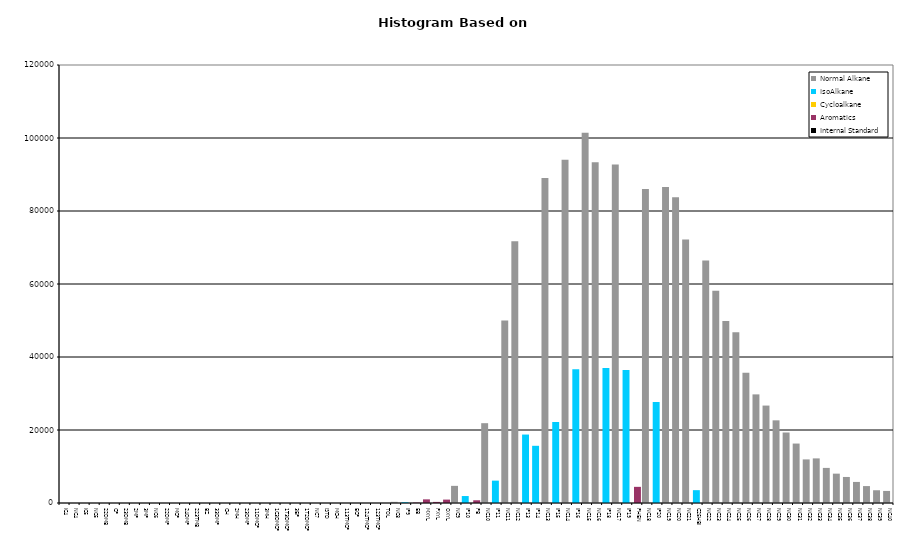
| Category | Normal Alkane | IsoAlkane | Cycloalkane | Aromatics | Internal Standard |
|---|---|---|---|---|---|
| IC4 | 0 | 0 | 0 | 0 | 0 |
| NC4 | 0 | 0 | 0 | 0 | 0 |
| IC5 | 0 | 0 | 0 | 0 | 0 |
| NC5 | 0 | 0 | 0 | 0 | 0 |
| 22DMB | 0 | 0 | 0 | 0 | 0 |
| CP | 0 | 0 | 0 | 0 | 0 |
| 23DMB | 0 | 0 | 0 | 0 | 0 |
| 2MP | 0 | 0 | 0 | 0 | 0 |
| 3MP | 0 | 0 | 0 | 0 | 0 |
| NC6 | 0 | 0 | 0 | 0 | 0 |
| 22DMP | 0 | 0 | 0 | 0 | 0 |
| MCP | 0 | 0 | 0 | 0 | 0 |
| 24DMP | 0 | 0 | 0 | 0 | 0 |
| 223TMB | 0 | 0 | 0 | 0 | 0 |
| BZ | 0 | 0 | 0 | 0 | 0 |
| 33DMP | 0 | 0 | 0 | 0 | 0 |
| CH | 0 | 0 | 0 | 0 | 0 |
| 2MH | 0 | 0 | 0 | 0 | 0 |
| 23DMP | 0 | 0 | 0 | 0 | 0 |
| 11DMCP | 0 | 0 | 0 | 0 | 0 |
| 3MH | 0 | 0 | 0 | 0 | 0 |
| 1C3DMCP | 0 | 0 | 0 | 0 | 0 |
| 1T3DMCP | 0 | 0 | 0 | 0 | 0 |
| 3EP | 0 | 0 | 0 | 0 | 0 |
| 1T2DMCP | 0 | 0 | 0 | 0 | 0 |
| NC7 | 0 | 0 | 0 | 0 | 0 |
| ISTD | 0 | 0 | 0 | 0 | 0 |
| MCH | 0 | 0 | 0 | 0 | 0 |
| 113TMCP | 0 | 0 | 0 | 0 | 0 |
| ECP | 0 | 0 | 0 | 0 | 0 |
| 124TMCP | 0 | 0 | 0 | 0 | 0 |
| 123TMCP | 0 | 0 | 0 | 0 | 0 |
| TOL | 0 | 0 | 0 | 0 | 0 |
| NC8 | 315 | 0 | 0 | 0 | 0 |
| IP9 | 0 | 213 | 0 | 0 | 0 |
| EB | 0 | 0 | 0 | 114 | 0 |
| MXYL | 0 | 0 | 0 | 997 | 0 |
| PXYL | 0 | 0 | 0 | 299 | 0 |
| OXYL | 0 | 0 | 0 | 932 | 0 |
| NC9 | 4696 | 0 | 0 | 0 | 0 |
| IP10 | 0 | 1908 | 0 | 0 | 0 |
| PB | 0 | 0 | 0 | 746 | 0 |
| NC10 | 21868 | 0 | 0 | 0 | 0 |
| IP11 | 0 | 6127 | 0 | 0 | 0 |
| NC11 | 49999 | 0 | 0 | 0 | 0 |
| NC12 | 71732 | 0 | 0 | 0 | 0 |
| IP13 | 0 | 18754 | 0 | 0 | 0 |
| IP14 | 0 | 15671 | 0 | 0 | 0 |
| NC13 | 89017 | 0 | 0 | 0 | 0 |
| IP15 | 0 | 22194 | 0 | 0 | 0 |
| NC14 | 94075 | 0 | 0 | 0 | 0 |
| IP16 | 0 | 36626 | 0 | 0 | 0 |
| NC15 | 101431 | 0 | 0 | 0 | 0 |
| NC16 | 93352 | 0 | 0 | 0 | 0 |
| IP18 | 0 | 37003 | 0 | 0 | 0 |
| NC17 | 92729 | 0 | 0 | 0 | 0 |
| IP19 | 0 | 36423 | 0 | 0 | 0 |
| PHEN | 0 | 0 | 0 | 4425 | 0 |
| NC18 | 86038 | 0 | 0 | 0 | 0 |
| IP20 | 0 | 27666 | 0 | 0 | 0 |
| NC19 | 86602 | 0 | 0 | 0 | 0 |
| NC20 | 83757 | 0 | 0 | 0 | 0 |
| NC21 | 72193 | 0 | 0 | 0 | 0 |
| C25HBI | 0 | 3516 | 0 | 0 | 0 |
| NC22 | 66442 | 0 | 0 | 0 | 0 |
| NC23 | 58150 | 0 | 0 | 0 | 0 |
| NC24 | 49867 | 0 | 0 | 0 | 0 |
| NC25 | 46784 | 0 | 0 | 0 | 0 |
| NC26 | 35676 | 0 | 0 | 0 | 0 |
| NC27 | 29759 | 0 | 0 | 0 | 0 |
| NC28 | 26693 | 0 | 0 | 0 | 0 |
| NC29 | 22649 | 0 | 0 | 0 | 0 |
| NC30 | 19316 | 0 | 0 | 0 | 0 |
| NC31 | 16286 | 0 | 0 | 0 | 0 |
| NC32 | 11943 | 0 | 0 | 0 | 0 |
| NC33 | 12223 | 0 | 0 | 0 | 0 |
| NC34 | 9615 | 0 | 0 | 0 | 0 |
| NC35 | 8041 | 0 | 0 | 0 | 0 |
| NC36 | 7132 | 0 | 0 | 0 | 0 |
| NC37 | 5772 | 0 | 0 | 0 | 0 |
| NC38 | 4638 | 0 | 0 | 0 | 0 |
| NC39 | 3493 | 0 | 0 | 0 | 0 |
| NC40 | 3306 | 0 | 0 | 0 | 0 |